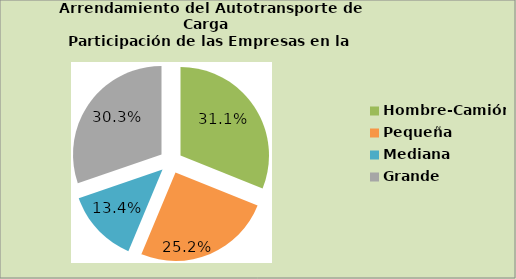
| Category | Series 0 |
|---|---|
| Hombre-Camión | 31.092 |
| Pequeña | 25.21 |
| Mediana | 13.445 |
| Grande | 30.252 |